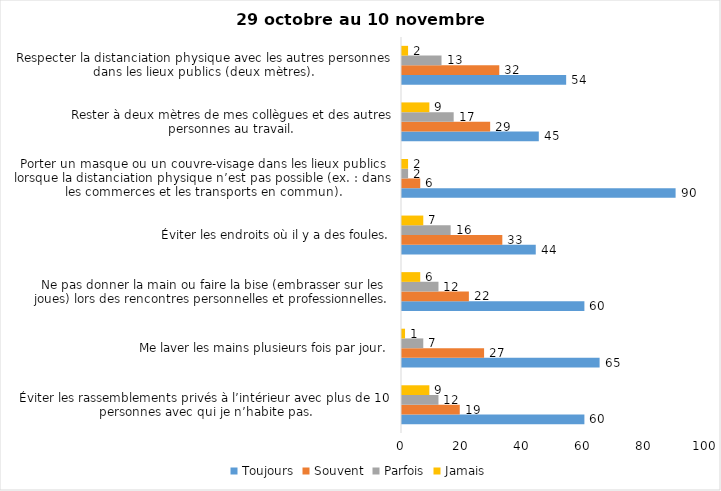
| Category | Toujours | Souvent | Parfois | Jamais |
|---|---|---|---|---|
| Éviter les rassemblements privés à l’intérieur avec plus de 10 personnes avec qui je n’habite pas. | 60 | 19 | 12 | 9 |
| Me laver les mains plusieurs fois par jour. | 65 | 27 | 7 | 1 |
| Ne pas donner la main ou faire la bise (embrasser sur les joues) lors des rencontres personnelles et professionnelles. | 60 | 22 | 12 | 6 |
| Éviter les endroits où il y a des foules. | 44 | 33 | 16 | 7 |
| Porter un masque ou un couvre-visage dans les lieux publics lorsque la distanciation physique n’est pas possible (ex. : dans les commerces et les transports en commun). | 90 | 6 | 2 | 2 |
| Rester à deux mètres de mes collègues et des autres personnes au travail. | 45 | 29 | 17 | 9 |
| Respecter la distanciation physique avec les autres personnes dans les lieux publics (deux mètres). | 54 | 32 | 13 | 2 |